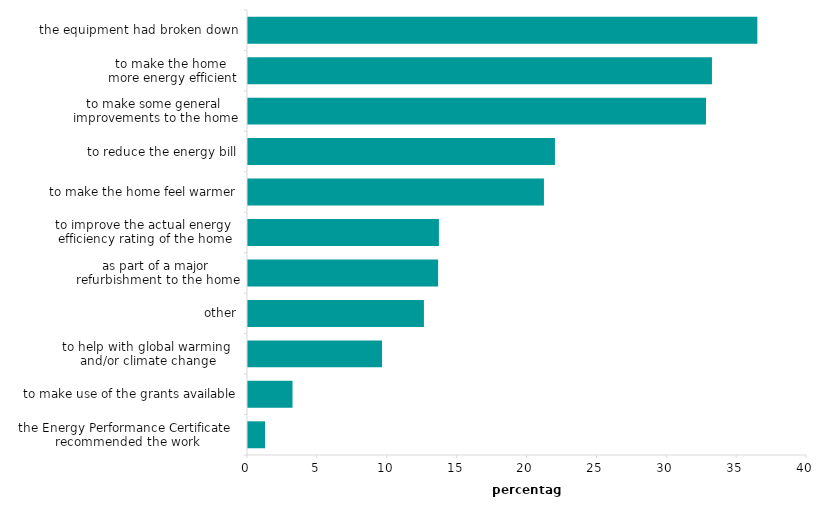
| Category | reasons given |
|---|---|
| the equipment had broken down | 36.519 |
| to make the home 
more energy efficient | 33.27 |
| to make some general 
improvements to the home | 32.843 |
| to reduce the energy bill | 22.035 |
| to make the home feel warmer | 21.248 |
| to improve the actual energy 
efficiency rating of the home | 13.732 |
| as part of a major 
refurbishment to the home | 13.675 |
| other | 12.66 |
| to help with global warming 
and/or climate change | 9.663 |
| to make use of the grants available | 3.257 |
| the Energy Performance Certificate 
recommended the work | 1.29 |